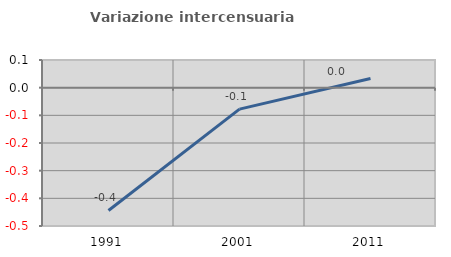
| Category | Variazione intercensuaria annua |
|---|---|
| 1991.0 | -0.444 |
| 2001.0 | -0.078 |
| 2011.0 | 0.033 |